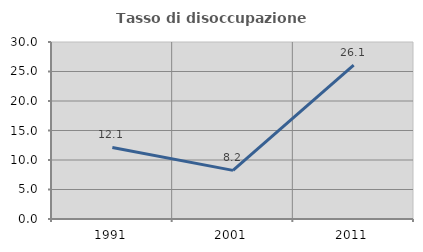
| Category | Tasso di disoccupazione giovanile  |
|---|---|
| 1991.0 | 12.121 |
| 2001.0 | 8.239 |
| 2011.0 | 26.07 |